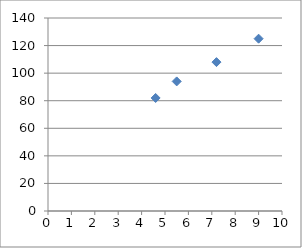
| Category | altezza |
|---|---|
| 4.6 | 82 |
| 5.5 | 94 |
| 7.2 | 108 |
| 9.0 | 125 |